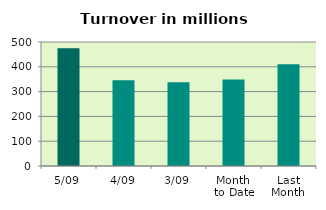
| Category | Series 0 |
|---|---|
| 5/09 | 474.493 |
| 4/09 | 345.649 |
| 3/09 | 337.727 |
| Month 
to Date | 348.314 |
| Last
Month | 410.207 |